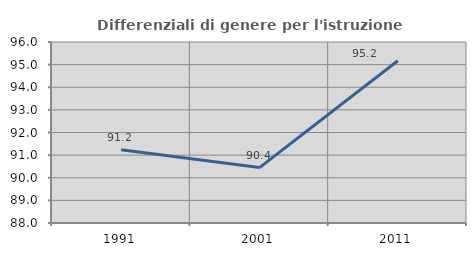
| Category | Differenziali di genere per l'istruzione superiore |
|---|---|
| 1991.0 | 91.235 |
| 2001.0 | 90.449 |
| 2011.0 | 95.169 |